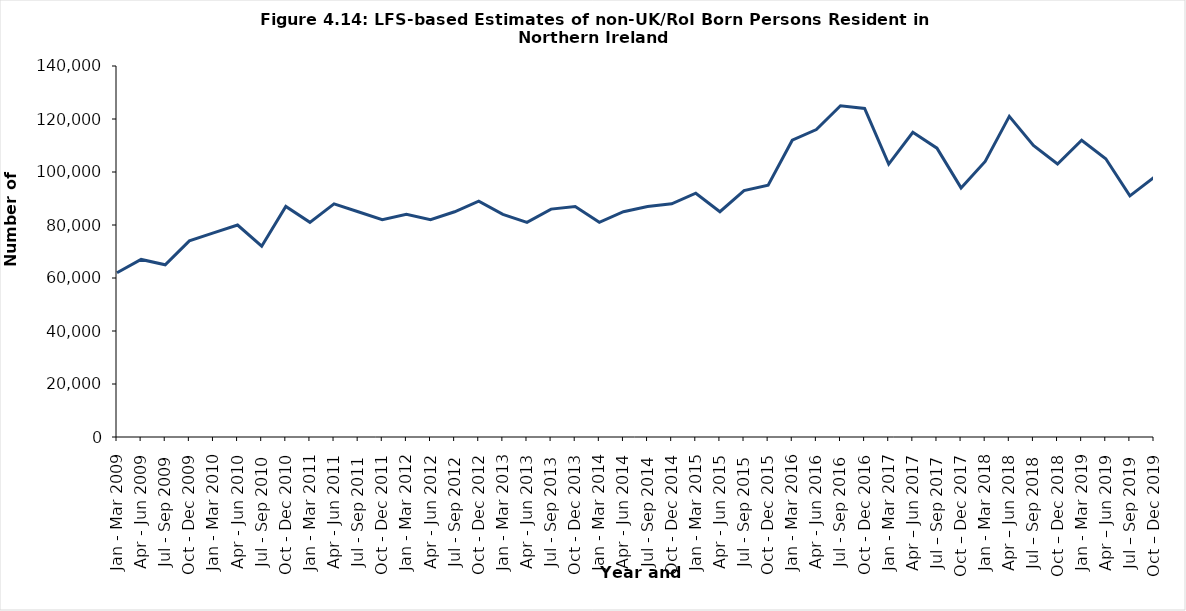
| Category | Series 0 |
|---|---|
| Jan - Mar 2009 | 62000 |
| Apr - Jun 2009 | 67000 |
| Jul - Sep 2009 | 65000 |
| Oct - Dec 2009 | 74000 |
| Jan - Mar 2010 | 77000 |
| Apr - Jun 2010 | 80000 |
| Jul - Sep 2010 | 72000 |
| Oct - Dec 2010 | 87000 |
| Jan - Mar 2011 | 81000 |
| Apr - Jun 2011 | 88000 |
| Jul - Sep 2011 | 85000 |
| Oct - Dec 2011 | 82000 |
| Jan - Mar 2012 | 84000 |
| Apr - Jun 2012 | 82000 |
| Jul - Sep 2012 | 85000 |
| Oct - Dec 2012 | 89000 |
| Jan - Mar 2013 | 84000 |
| Apr - Jun 2013 | 81000 |
| Jul - Sep 2013 | 86000 |
| Oct - Dec 2013 | 87000 |
| Jan - Mar 2014 | 81000 |
| Apr - Jun 2014 | 85000 |
| Jul - Sep 2014 | 87000 |
| Oct - Dec 2014 | 88000 |
| Jan - Mar 2015 | 92000 |
| Apr - Jun 2015 | 85000 |
| Jul - Sep 2015 | 93000 |
| Oct - Dec 2015 | 95000 |
| Jan - Mar 2016 | 112000 |
| Apr - Jun 2016 | 116000 |
| Jul - Sep 2016 | 125000 |
| Oct - Dec 2016 | 124000 |
| Jan - Mar 2017 | 103000 |
| Apr – Jun 2017 | 115000 |
| Jul – Sep 2017 | 109000 |
| Oct – Dec 2017 | 94000 |
| Jan - Mar 2018 | 104000 |
| Apr – Jun 2018 | 121000 |
| Jul – Sep 2018 | 110000 |
| Oct – Dec 2018 | 103000 |
| Jan - Mar 2019 | 112000 |
| Apr – Jun 2019 | 105000 |
| Jul – Sep 2019 | 91000 |
| Oct – Dec 2019 | 98000 |